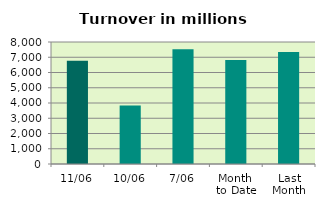
| Category | Series 0 |
|---|---|
| 11/06 | 6771.847 |
| 10/06 | 3840.909 |
| 7/06 | 7517.275 |
| Month 
to Date | 6821.645 |
| Last
Month | 7336.2 |